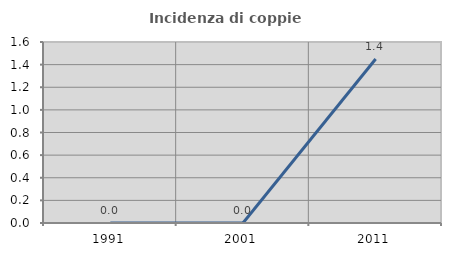
| Category | Incidenza di coppie miste |
|---|---|
| 1991.0 | 0 |
| 2001.0 | 0 |
| 2011.0 | 1.449 |